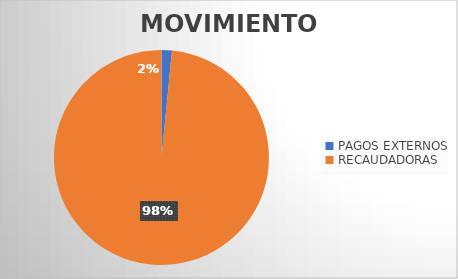
| Category | MOVIMIENTOS |
|---|---|
| PAGOS EXTERNOS | 370 |
| RECAUDADORAS | 23337 |